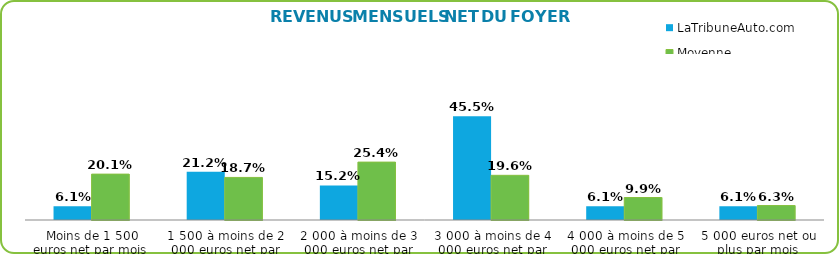
| Category | LaTribuneAuto.com | Moyenne Internautes* |
|---|---|---|
| Moins de 1 500 euros net par mois  | 0.061 | 0.201 |
| 1 500 à moins de 2 000 euros net par mois | 0.212 | 0.187 |
| 2 000 à moins de 3 000 euros net par mois | 0.152 | 0.254 |
| 3 000 à moins de 4 000 euros net par mois | 0.455 | 0.196 |
| 4 000 à moins de 5 000 euros net par mois | 0.061 | 0.099 |
| 5 000 euros net ou plus par mois | 0.061 | 0.063 |